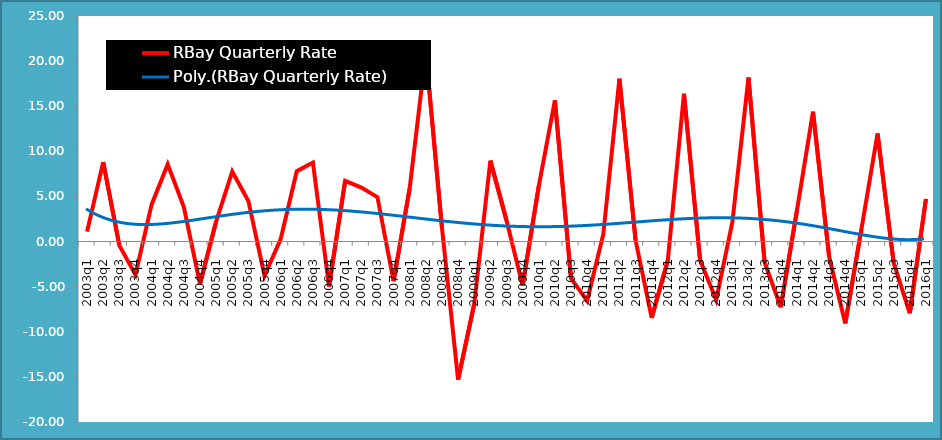
| Category | RBay Quarterly Rate |
|---|---|
| 2003q1 | 1.098 |
| 2003q2 | 8.804 |
| 2003q3 | -0.426 |
| 2003q4 | -3.68 |
| 2004q1 | 4.091 |
| 2004q2 | 8.565 |
| 2004q3 | 3.826 |
| 2004q4 | -4.708 |
| 2005q1 | 2.222 |
| 2005q2 | 7.753 |
| 2005q3 | 4.504 |
| 2005q4 | -3.79 |
| 2006q1 | 0.268 |
| 2006q2 | 7.797 |
| 2006q3 | 8.753 |
| 2006q4 | -4.973 |
| 2007q1 | 6.736 |
| 2007q2 | 5.975 |
| 2007q3 | 4.922 |
| 2007q4 | -4.398 |
| 2008q1 | 5.931 |
| 2008q2 | 20.969 |
| 2008q3 | 1.515 |
| 2008q4 | -15.309 |
| 2009q1 | -6.92 |
| 2009q2 | 8.972 |
| 2009q3 | 2.346 |
| 2009q4 | -4.877 |
| 2010q1 | 6.137 |
| 2010q2 | 15.657 |
| 2010q3 | -4.083 |
| 2010q4 | -6.571 |
| 2011q1 | 0.808 |
| 2011q2 | 18.046 |
| 2011q3 | 0.157 |
| 2011q4 | -8.455 |
| 2012q1 | -2.075 |
| 2012q2 | 16.383 |
| 2012q3 | -2.044 |
| 2012q4 | -6.475 |
| 2013q1 | 2.156 |
| 2013q2 | 18.18 |
| 2013q3 | -2.292 |
| 2013q4 | -7.285 |
| 2014q1 | 3.406 |
| 2014q2 | 14.395 |
| 2014q3 | -1.688 |
| 2014q4 | -9.078 |
| 2015q1 | 1.354 |
| 2015q2 | 11.975 |
| 2015q3 | -2.369 |
| 2015q4 | -7.949 |
| 2016q1 | 4.722 |